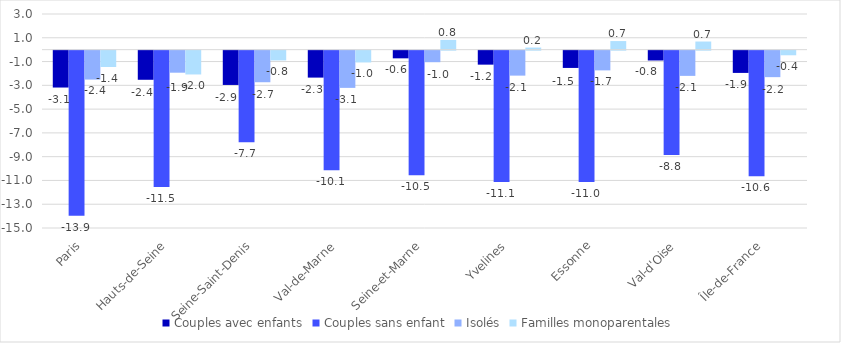
| Category | Couples avec enfants | Couples sans enfant | Isolés | Familles monoparentales |
|---|---|---|---|---|
| Paris | -3.101 | -13.887 | -2.431 | -1.376 |
| Hauts-de-Seine | -2.449 | -11.468 | -1.853 | -2.002 |
| Seine-Saint-Denis | -2.883 | -7.711 | -2.655 | -0.822 |
| Val-de-Marne | -2.266 | -10.068 | -3.13 | -0.991 |
| Seine-et-Marne | -0.645 | -10.484 | -0.969 | 0.823 |
| Yvelines | -1.176 | -11.053 | -2.099 | 0.177 |
| Essonne | -1.453 | -11.046 | -1.658 | 0.724 |
| Val-d'Oise | -0.826 | -8.784 | -2.12 | 0.685 |
| Île-de-France | -1.871 | -10.553 | -2.227 | -0.388 |